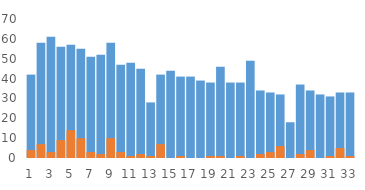
| Category | Schedules | Changes |
|---|---|---|
| 0 | 42 | 4 |
| 1 | 58 | 7 |
| 2 | 61 | 3 |
| 3 | 56 | 9 |
| 4 | 57 | 14 |
| 5 | 55 | 10 |
| 6 | 51 | 3 |
| 7 | 52 | 2 |
| 8 | 58 | 10 |
| 9 | 47 | 3 |
| 10 | 48 | 1 |
| 11 | 45 | 2 |
| 12 | 28 | 1 |
| 13 | 42 | 7 |
| 14 | 44 | 0 |
| 15 | 41 | 1 |
| 16 | 41 | 0 |
| 17 | 39 | 0 |
| 18 | 38 | 1 |
| 19 | 46 | 1 |
| 20 | 38 | 0 |
| 21 | 38 | 1 |
| 22 | 49 | 0 |
| 23 | 34 | 2 |
| 24 | 33 | 3 |
| 25 | 32 | 6 |
| 26 | 18 | 0 |
| 27 | 37 | 2 |
| 28 | 34 | 4 |
| 29 | 32 | 0 |
| 30 | 31 | 1 |
| 31 | 33 | 5 |
| 32 | 33 | 1 |